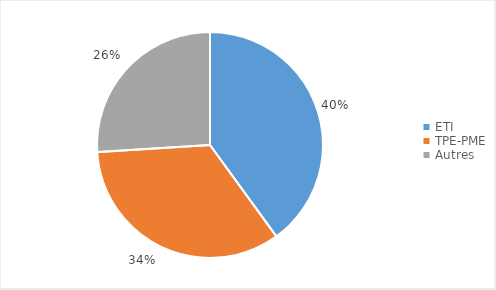
| Category | Series 0 |
|---|---|
| ETI | 0.4 |
| TPE-PME | 0.34 |
| Autres | 0.26 |